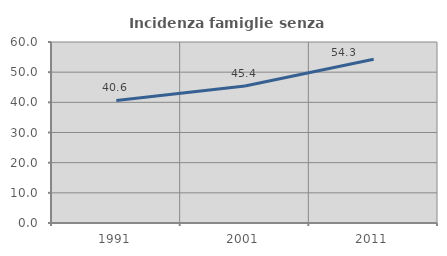
| Category | Incidenza famiglie senza nuclei |
|---|---|
| 1991.0 | 40.614 |
| 2001.0 | 45.385 |
| 2011.0 | 54.286 |